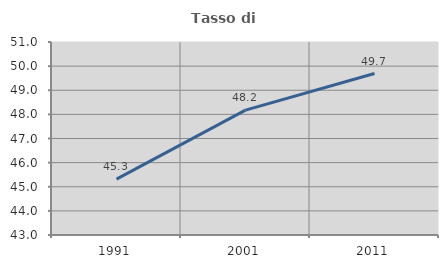
| Category | Tasso di occupazione   |
|---|---|
| 1991.0 | 45.317 |
| 2001.0 | 48.174 |
| 2011.0 | 49.692 |